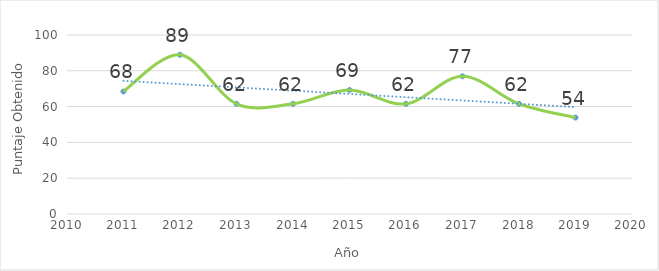
| Category | 54 |
|---|---|
| 2011.0 | 68.42 |
| 2012.0 | 88.9 |
| 2013.0 | 61.54 |
| 2014.0 | 61.5 |
| 2015.0 | 69.2 |
| 2016.0 | 61.5 |
| 2017.0 | 76.9 |
| 2018.0 | 61.5 |
| 2019.0 | 53.846 |